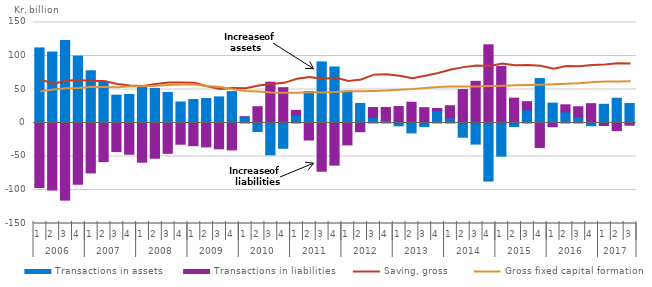
| Category | Transactions in assets | Transactions in liabilities |
|---|---|---|
| 0 | 112.028 | -96.248 |
| 1 | 105.928 | -100.098 |
| 2 | 123.187 | -115.124 |
| 3 | 99.856 | -91.392 |
| 4 | 77.894 | -74.481 |
| 5 | 60.865 | -57.635 |
| 6 | 41.57 | -42.675 |
| 7 | 42.497 | -46.621 |
| 8 | 54.631 | -58.509 |
| 9 | 51.671 | -52.596 |
| 10 | 45.654 | -45.231 |
| 11 | 31.356 | -31.699 |
| 12 | 35.051 | -33.886 |
| 13 | 36.514 | -35.692 |
| 14 | 39.001 | -38.565 |
| 15 | 46.852 | -40.176 |
| 16 | 8.917 | 0.316 |
| 17 | -12.756 | 24.328 |
| 18 | -47.538 | 60.885 |
| 19 | -37.684 | 52.715 |
| 20 | 11.288 | 7.525 |
| 21 | 46.958 | -25.42 |
| 22 | 91.158 | -72.015 |
| 23 | 83.648 | -62.913 |
| 24 | 47.515 | -32.696 |
| 25 | 29.133 | -12.993 |
| 26 | 8.214 | 14.876 |
| 27 | 3.971 | 19.254 |
| 28 | -4.237 | 24.673 |
| 29 | -14.756 | 30.986 |
| 30 | -5.108 | 22.901 |
| 31 | 18.802 | 2.8 |
| 32 | 7.522 | 18.32 |
| 33 | -21.253 | 49.933 |
| 34 | -31.494 | 62.239 |
| 35 | -86.659 | 116.712 |
| 36 | -49.476 | 84.387 |
| 37 | -5.263 | 37.086 |
| 38 | 19.728 | 12.13 |
| 39 | 66.345 | -36.527 |
| 40 | 29.658 | -5.627 |
| 41 | 16.543 | 10.628 |
| 42 | 9.111 | 15.155 |
| 43 | -4.112 | 28.867 |
| 44 | 27.922 | -3.718 |
| 45 | 36.928 | -11.427 |
| 46 | 29.012 | -3.301 |